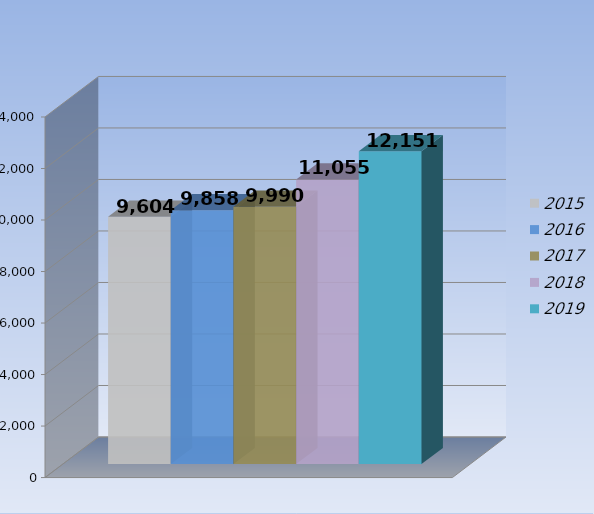
| Category | 2015 | 2016 | 2017 | 2018 | 2019 |
|---|---|---|---|---|---|
| 0 | 9604 | 9858 | 9990 | 11055 | 12151 |